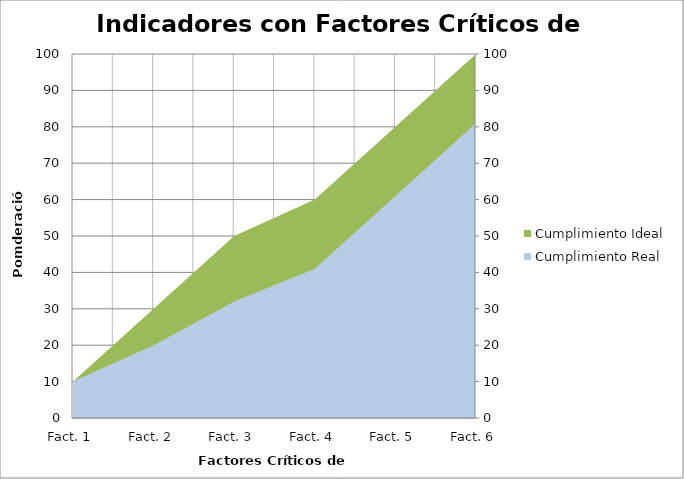
| Category | Cumplimiento Ideal |
|---|---|
| Fact. 1 | 10 |
| Fact. 2 | 30 |
| Fact. 3 | 50 |
| Fact. 4 | 60 |
| Fact. 5 | 80 |
| Fact. 6 | 100 |